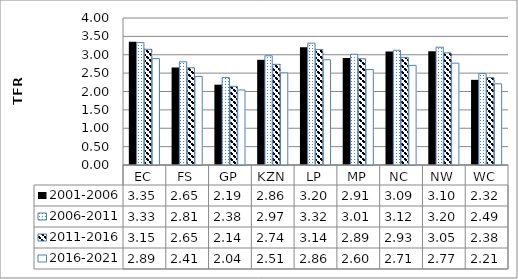
| Category | 2001-2006 | 2006-2011 | 2011-2016 | 2016-2021 |
|---|---|---|---|---|
| EC | 3.353 | 3.331 | 3.149 | 2.894 |
| FS | 2.653 | 2.809 | 2.645 | 2.41 |
| GP | 2.186 | 2.38 | 2.141 | 2.042 |
| KZN | 2.862 | 2.972 | 2.739 | 2.506 |
| LP | 3.204 | 3.316 | 3.144 | 2.862 |
| MP | 2.91 | 3.013 | 2.891 | 2.599 |
| NC | 3.09 | 3.122 | 2.929 | 2.711 |
| NW | 3.098 | 3.205 | 3.051 | 2.771 |
| WC | 2.317 | 2.49 | 2.378 | 2.21 |